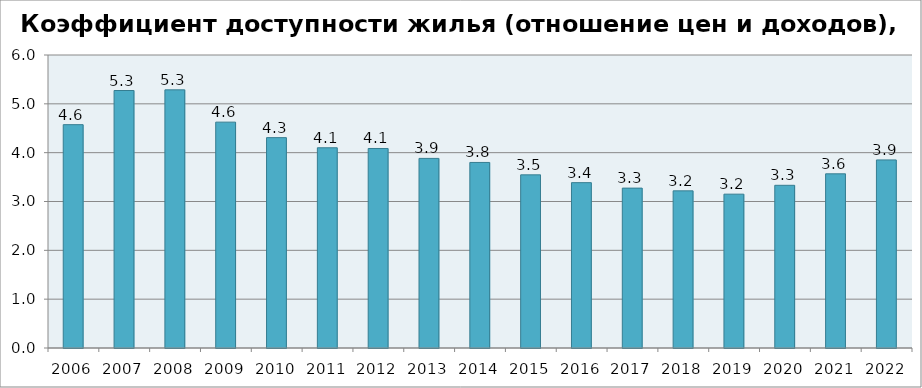
| Category | Series 0 |
|---|---|
| 2006.0 | 4.574 |
| 2007.0 | 5.273 |
| 2008.0 | 5.286 |
| 2009.0 | 4.625 |
| 2010.0 | 4.308 |
| 2011.0 | 4.1 |
| 2012.0 | 4.085 |
| 2013.0 | 3.883 |
| 2014.0 | 3.8 |
| 2015.0 | 3.546 |
| 2016.0 | 3.386 |
| 2017.0 | 3.274 |
| 2018.0 | 3.218 |
| 2019.0 | 3.15 |
| 2020.0 | 3.332 |
| 2021.0 | 3.567 |
| 2022.0 | 3.851 |